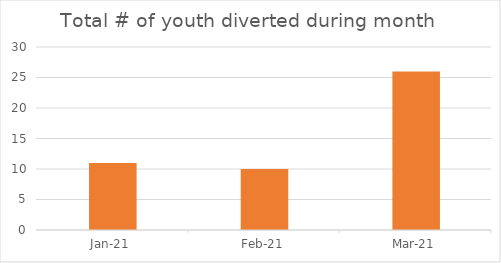
| Category | Total # of youth diverted during month (autocalculation) |
|---|---|
| 2021-01-01 | 11 |
| 2021-02-01 | 10 |
| 2021-03-01 | 26 |